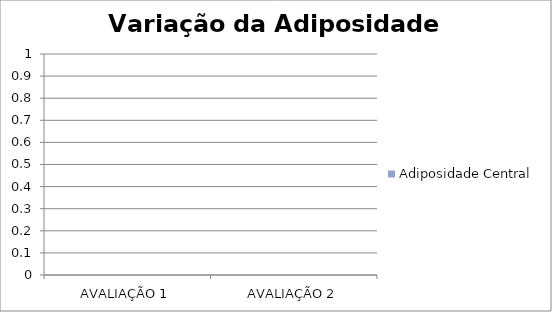
| Category | Adiposidade Central |
|---|---|
| AVALIAÇÃO 1 | 0 |
| AVALIAÇÃO 2 | 0 |